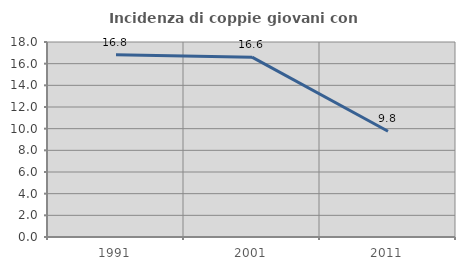
| Category | Incidenza di coppie giovani con figli |
|---|---|
| 1991.0 | 16.814 |
| 2001.0 | 16.599 |
| 2011.0 | 9.766 |